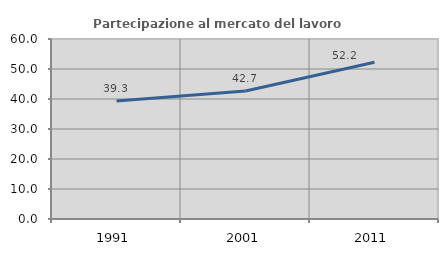
| Category | Partecipazione al mercato del lavoro  femminile |
|---|---|
| 1991.0 | 39.326 |
| 2001.0 | 42.665 |
| 2011.0 | 52.222 |